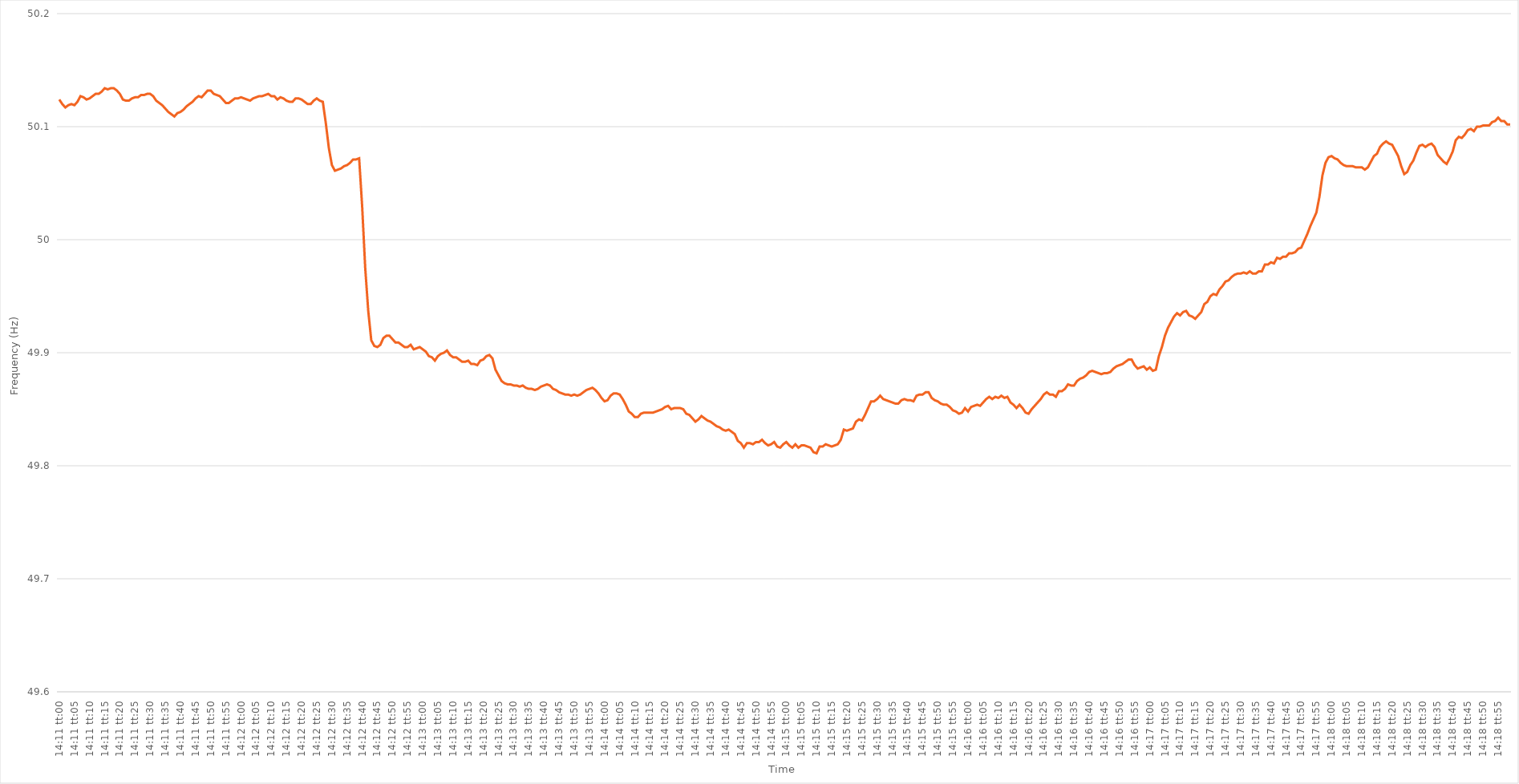
| Category | Series 0 |
|---|---|
| 0.5909722222222222 | 50.124 |
| 0.5909837962962963 | 50.12 |
| 0.5909953703703704 | 50.117 |
| 0.5910069444444445 | 50.119 |
| 0.5910185185185185 | 50.12 |
| 0.5910300925925925 | 50.119 |
| 0.5910416666666667 | 50.122 |
| 0.5910532407407407 | 50.127 |
| 0.5910648148148149 | 50.126 |
| 0.5910763888888889 | 50.124 |
| 0.591087962962963 | 50.125 |
| 0.591099537037037 | 50.127 |
| 0.5911111111111111 | 50.129 |
| 0.5911226851851852 | 50.129 |
| 0.5911342592592593 | 50.131 |
| 0.5911458333333334 | 50.134 |
| 0.5911574074074074 | 50.133 |
| 0.5911689814814814 | 50.134 |
| 0.5911805555555555 | 50.134 |
| 0.5911921296296296 | 50.132 |
| 0.5912037037037037 | 50.129 |
| 0.5912152777777778 | 50.124 |
| 0.5912268518518519 | 50.123 |
| 0.5912384259259259 | 50.123 |
| 0.5912499999999999 | 50.125 |
| 0.5912615740740741 | 50.126 |
| 0.5912731481481481 | 50.126 |
| 0.5912847222222223 | 50.128 |
| 0.5912962962962963 | 50.128 |
| 0.5913078703703704 | 50.129 |
| 0.5913194444444444 | 50.129 |
| 0.5913310185185185 | 50.127 |
| 0.5913425925925926 | 50.123 |
| 0.5913541666666667 | 50.121 |
| 0.5913657407407408 | 50.119 |
| 0.5913773148148148 | 50.116 |
| 0.5913888888888889 | 50.113 |
| 0.5914004629629629 | 50.111 |
| 0.591412037037037 | 50.109 |
| 0.5914236111111111 | 50.112 |
| 0.5914351851851852 | 50.113 |
| 0.5914467592592593 | 50.115 |
| 0.5914583333333333 | 50.118 |
| 0.5914699074074073 | 50.12 |
| 0.5914814814814815 | 50.122 |
| 0.5914930555555555 | 50.125 |
| 0.5915046296296297 | 50.127 |
| 0.5915162037037037 | 50.126 |
| 0.5915277777777778 | 50.129 |
| 0.5915393518518518 | 50.132 |
| 0.591550925925926 | 50.132 |
| 0.5915625 | 50.129 |
| 0.5915740740740741 | 50.128 |
| 0.5915856481481482 | 50.127 |
| 0.5915972222222222 | 50.124 |
| 0.5916087962962963 | 50.121 |
| 0.5916203703703703 | 50.121 |
| 0.5916319444444444 | 50.123 |
| 0.5916435185185185 | 50.125 |
| 0.5916550925925926 | 50.125 |
| 0.5916666666666667 | 50.126 |
| 0.5916782407407407 | 50.125 |
| 0.5916898148148148 | 50.124 |
| 0.5917013888888889 | 50.123 |
| 0.5917129629629629 | 50.125 |
| 0.5917245370370371 | 50.126 |
| 0.5917361111111111 | 50.127 |
| 0.5917476851851852 | 50.127 |
| 0.5917592592592592 | 50.128 |
| 0.5917708333333334 | 50.129 |
| 0.5917824074074074 | 50.127 |
| 0.5917939814814815 | 50.127 |
| 0.5918055555555556 | 50.124 |
| 0.5918171296296296 | 50.126 |
| 0.5918287037037037 | 50.125 |
| 0.5918402777777778 | 50.123 |
| 0.5918518518518519 | 50.122 |
| 0.5918634259259259 | 50.122 |
| 0.591875 | 50.125 |
| 0.5918865740740741 | 50.125 |
| 0.5918981481481481 | 50.124 |
| 0.5919097222222222 | 50.122 |
| 0.5919212962962963 | 50.12 |
| 0.5919328703703703 | 50.12 |
| 0.5919444444444445 | 50.123 |
| 0.5919560185185185 | 50.125 |
| 0.5919675925925926 | 50.123 |
| 0.5919791666666666 | 50.122 |
| 0.5919907407407408 | 50.103 |
| 0.5920023148148148 | 50.081 |
| 0.592013888888889 | 50.066 |
| 0.592025462962963 | 50.061 |
| 0.592037037037037 | 50.062 |
| 0.5920486111111111 | 50.063 |
| 0.5920601851851852 | 50.065 |
| 0.5920717592592593 | 50.066 |
| 0.5920833333333334 | 50.068 |
| 0.5920949074074074 | 50.071 |
| 0.5921064814814815 | 50.071 |
| 0.5921180555555555 | 50.072 |
| 0.5921296296296296 | 50.029 |
| 0.5921412037037037 | 49.975 |
| 0.5921527777777778 | 49.937 |
| 0.5921643518518519 | 49.911 |
| 0.5921759259259259 | 49.906 |
| 0.5921875 | 49.905 |
| 0.592199074074074 | 49.907 |
| 0.5922106481481482 | 49.913 |
| 0.5922222222222222 | 49.915 |
| 0.5922337962962964 | 49.915 |
| 0.5922453703703704 | 49.912 |
| 0.5922569444444444 | 49.909 |
| 0.5922685185185185 | 49.909 |
| 0.5922800925925926 | 49.907 |
| 0.5922916666666667 | 49.905 |
| 0.5923032407407408 | 49.905 |
| 0.5923148148148148 | 49.907 |
| 0.5923263888888889 | 49.903 |
| 0.5923379629629629 | 49.904 |
| 0.592349537037037 | 49.905 |
| 0.5923611111111111 | 49.903 |
| 0.5923726851851852 | 49.901 |
| 0.5923842592592593 | 49.897 |
| 0.5923958333333333 | 49.896 |
| 0.5924074074074074 | 49.893 |
| 0.5924189814814814 | 49.897 |
| 0.5924305555555556 | 49.899 |
| 0.5924421296296296 | 49.9 |
| 0.5924537037037038 | 49.902 |
| 0.5924652777777778 | 49.898 |
| 0.5924768518518518 | 49.896 |
| 0.5924884259259259 | 49.896 |
| 0.5925 | 49.894 |
| 0.5925115740740741 | 49.892 |
| 0.5925231481481482 | 49.892 |
| 0.5925347222222223 | 49.893 |
| 0.5925462962962963 | 49.89 |
| 0.5925578703703703 | 49.89 |
| 0.5925694444444445 | 49.889 |
| 0.5925810185185185 | 49.893 |
| 0.5925925925925926 | 49.894 |
| 0.5926041666666667 | 49.897 |
| 0.5926157407407407 | 49.898 |
| 0.5926273148148148 | 49.895 |
| 0.5926388888888888 | 49.885 |
| 0.592650462962963 | 49.88 |
| 0.592662037037037 | 49.875 |
| 0.5926736111111112 | 49.873 |
| 0.5926851851851852 | 49.872 |
| 0.5926967592592592 | 49.872 |
| 0.5927083333333333 | 49.871 |
| 0.5927199074074074 | 49.871 |
| 0.5927314814814815 | 49.87 |
| 0.5927430555555556 | 49.871 |
| 0.5927546296296297 | 49.869 |
| 0.5927662037037037 | 49.868 |
| 0.5927777777777777 | 49.868 |
| 0.5927893518518519 | 49.867 |
| 0.5928009259259259 | 49.868 |
| 0.5928125 | 49.87 |
| 0.5928240740740741 | 49.871 |
| 0.5928356481481482 | 49.872 |
| 0.5928472222222222 | 49.871 |
| 0.5928587962962962 | 49.868 |
| 0.5928703703703704 | 49.867 |
| 0.5928819444444444 | 49.865 |
| 0.5928935185185186 | 49.864 |
| 0.5929050925925926 | 49.863 |
| 0.5929166666666666 | 49.863 |
| 0.5929282407407407 | 49.862 |
| 0.5929398148148148 | 49.863 |
| 0.5929513888888889 | 49.862 |
| 0.592962962962963 | 49.863 |
| 0.5929745370370371 | 49.865 |
| 0.5929861111111111 | 49.867 |
| 0.5929976851851851 | 49.868 |
| 0.5930092592592593 | 49.869 |
| 0.5930208333333333 | 49.867 |
| 0.5930324074074075 | 49.864 |
| 0.5930439814814815 | 49.86 |
| 0.5930555555555556 | 49.857 |
| 0.5930671296296296 | 49.858 |
| 0.5930787037037036 | 49.862 |
| 0.5930902777777778 | 49.864 |
| 0.5931018518518518 | 49.864 |
| 0.593113425925926 | 49.863 |
| 0.593125 | 49.859 |
| 0.593136574074074 | 49.854 |
| 0.5931481481481481 | 49.848 |
| 0.5931597222222222 | 49.846 |
| 0.5931712962962963 | 49.843 |
| 0.5931828703703704 | 49.843 |
| 0.5931944444444445 | 49.846 |
| 0.5932060185185185 | 49.847 |
| 0.5932175925925925 | 49.847 |
| 0.5932291666666667 | 49.847 |
| 0.5932407407407407 | 49.847 |
| 0.5932523148148149 | 49.848 |
| 0.5932638888888889 | 49.849 |
| 0.593275462962963 | 49.85 |
| 0.593287037037037 | 49.852 |
| 0.593298611111111 | 49.853 |
| 0.5933101851851852 | 49.85 |
| 0.5933217592592592 | 49.851 |
| 0.5933333333333334 | 49.851 |
| 0.5933449074074074 | 49.851 |
| 0.5933564814814815 | 49.85 |
| 0.5933680555555555 | 49.846 |
| 0.5933796296296296 | 49.845 |
| 0.5933912037037037 | 49.842 |
| 0.5934027777777778 | 49.839 |
| 0.5934143518518519 | 49.841 |
| 0.5934259259259259 | 49.844 |
| 0.5934375 | 49.842 |
| 0.5934490740740741 | 49.84 |
| 0.5934606481481481 | 49.839 |
| 0.5934722222222223 | 49.837 |
| 0.5934837962962963 | 49.835 |
| 0.5934953703703704 | 49.834 |
| 0.5935069444444444 | 49.832 |
| 0.5935185185185184 | 49.831 |
| 0.5935300925925926 | 49.832 |
| 0.5935416666666666 | 49.83 |
| 0.5935532407407408 | 49.828 |
| 0.5935648148148148 | 49.822 |
| 0.5935763888888889 | 49.82 |
| 0.5935879629629629 | 49.816 |
| 0.593599537037037 | 49.82 |
| 0.5936111111111111 | 49.82 |
| 0.5936226851851852 | 49.819 |
| 0.5936342592592593 | 49.821 |
| 0.5936458333333333 | 49.821 |
| 0.5936574074074074 | 49.823 |
| 0.5936689814814815 | 49.82 |
| 0.5936805555555555 | 49.818 |
| 0.5936921296296297 | 49.819 |
| 0.5937037037037037 | 49.821 |
| 0.5937152777777778 | 49.817 |
| 0.5937268518518518 | 49.816 |
| 0.593738425925926 | 49.819 |
| 0.59375 | 49.821 |
| 0.593761574074074 | 49.818 |
| 0.5937731481481482 | 49.816 |
| 0.5937847222222222 | 49.819 |
| 0.5937962962962963 | 49.816 |
| 0.5938078703703703 | 49.818 |
| 0.5938194444444445 | 49.818 |
| 0.5938310185185185 | 49.817 |
| 0.5938425925925926 | 49.816 |
| 0.5938541666666667 | 49.812 |
| 0.5938657407407407 | 49.811 |
| 0.5938773148148148 | 49.817 |
| 0.5938888888888889 | 49.817 |
| 0.593900462962963 | 49.819 |
| 0.5939120370370371 | 49.818 |
| 0.5939236111111111 | 49.817 |
| 0.5939351851851852 | 49.818 |
| 0.5939467592592592 | 49.819 |
| 0.5939583333333334 | 49.823 |
| 0.5939699074074074 | 49.832 |
| 0.5939814814814816 | 49.831 |
| 0.5939930555555556 | 49.832 |
| 0.5940046296296296 | 49.833 |
| 0.5940162037037037 | 49.839 |
| 0.5940277777777777 | 49.841 |
| 0.5940393518518519 | 49.84 |
| 0.5940509259259259 | 49.845 |
| 0.5940625 | 49.851 |
| 0.5940740740740741 | 49.857 |
| 0.5940856481481481 | 49.857 |
| 0.5940972222222222 | 49.859 |
| 0.5941087962962963 | 49.862 |
| 0.5941203703703704 | 49.859 |
| 0.5941319444444445 | 49.858 |
| 0.5941435185185185 | 49.857 |
| 0.5941550925925926 | 49.856 |
| 0.5941666666666666 | 49.855 |
| 0.5941782407407408 | 49.855 |
| 0.5941898148148148 | 49.858 |
| 0.594201388888889 | 49.859 |
| 0.594212962962963 | 49.858 |
| 0.594224537037037 | 49.858 |
| 0.5942361111111111 | 49.857 |
| 0.5942476851851851 | 49.862 |
| 0.5942592592592593 | 49.863 |
| 0.5942708333333333 | 49.863 |
| 0.5942824074074075 | 49.865 |
| 0.5942939814814815 | 49.865 |
| 0.5943055555555555 | 49.86 |
| 0.5943171296296296 | 49.858 |
| 0.5943287037037037 | 49.857 |
| 0.5943402777777778 | 49.855 |
| 0.5943518518518519 | 49.854 |
| 0.594363425925926 | 49.854 |
| 0.594375 | 49.852 |
| 0.594386574074074 | 49.849 |
| 0.5943981481481482 | 49.848 |
| 0.5944097222222222 | 49.846 |
| 0.5944212962962964 | 49.847 |
| 0.5944328703703704 | 49.851 |
| 0.5944444444444444 | 49.848 |
| 0.5944560185185185 | 49.852 |
| 0.5944675925925926 | 49.853 |
| 0.5944791666666667 | 49.854 |
| 0.5944907407407407 | 49.853 |
| 0.5945023148148149 | 49.856 |
| 0.5945138888888889 | 49.859 |
| 0.5945254629629629 | 49.861 |
| 0.594537037037037 | 49.859 |
| 0.5945486111111111 | 49.861 |
| 0.5945601851851852 | 49.86 |
| 0.5945717592592593 | 49.862 |
| 0.5945833333333334 | 49.86 |
| 0.5945949074074074 | 49.861 |
| 0.5946064814814814 | 49.856 |
| 0.5946180555555556 | 49.854 |
| 0.5946296296296296 | 49.851 |
| 0.5946412037037038 | 49.854 |
| 0.5946527777777778 | 49.851 |
| 0.5946643518518518 | 49.847 |
| 0.5946759259259259 | 49.846 |
| 0.5946875 | 49.85 |
| 0.5946990740740741 | 49.853 |
| 0.5947106481481481 | 49.856 |
| 0.5947222222222223 | 49.859 |
| 0.5947337962962963 | 49.863 |
| 0.5947453703703703 | 49.865 |
| 0.5947569444444444 | 49.863 |
| 0.5947685185185185 | 49.863 |
| 0.5947800925925926 | 49.861 |
| 0.5947916666666667 | 49.866 |
| 0.5948032407407408 | 49.866 |
| 0.5948148148148148 | 49.868 |
| 0.5948263888888888 | 49.872 |
| 0.594837962962963 | 49.871 |
| 0.594849537037037 | 49.871 |
| 0.5948611111111112 | 49.875 |
| 0.5948726851851852 | 49.877 |
| 0.5948842592592593 | 49.878 |
| 0.5948958333333333 | 49.88 |
| 0.5949074074074074 | 49.883 |
| 0.5949189814814815 | 49.884 |
| 0.5949305555555555 | 49.883 |
| 0.5949421296296297 | 49.882 |
| 0.5949537037037037 | 49.881 |
| 0.5949652777777777 | 49.882 |
| 0.5949768518518518 | 49.882 |
| 0.5949884259259259 | 49.883 |
| 0.595 | 49.886 |
| 0.5950115740740741 | 49.888 |
| 0.5950231481481482 | 49.889 |
| 0.5950347222222222 | 49.89 |
| 0.5950462962962962 | 49.892 |
| 0.5950578703703704 | 49.894 |
| 0.5950694444444444 | 49.894 |
| 0.5950810185185186 | 49.889 |
| 0.5950925925925926 | 49.886 |
| 0.5951041666666667 | 49.887 |
| 0.5951157407407407 | 49.888 |
| 0.5951273148148148 | 49.885 |
| 0.5951388888888889 | 49.887 |
| 0.595150462962963 | 49.884 |
| 0.5951620370370371 | 49.885 |
| 0.5951736111111111 | 49.897 |
| 0.5951851851851852 | 49.905 |
| 0.5951967592592592 | 49.915 |
| 0.5952083333333333 | 49.922 |
| 0.5952199074074074 | 49.927 |
| 0.5952314814814815 | 49.932 |
| 0.5952430555555556 | 49.935 |
| 0.5952546296296296 | 49.933 |
| 0.5952662037037036 | 49.936 |
| 0.5952777777777778 | 49.937 |
| 0.5952893518518518 | 49.933 |
| 0.595300925925926 | 49.932 |
| 0.5953125 | 49.93 |
| 0.5953240740740741 | 49.933 |
| 0.5953356481481481 | 49.936 |
| 0.5953472222222222 | 49.943 |
| 0.5953587962962963 | 49.945 |
| 0.5953703703703704 | 49.95 |
| 0.5953819444444445 | 49.952 |
| 0.5953935185185185 | 49.951 |
| 0.5954050925925926 | 49.956 |
| 0.5954166666666666 | 49.959 |
| 0.5954282407407407 | 49.963 |
| 0.5954398148148148 | 49.964 |
| 0.5954513888888889 | 49.967 |
| 0.595462962962963 | 49.969 |
| 0.595474537037037 | 49.97 |
| 0.595486111111111 | 49.97 |
| 0.5954976851851852 | 49.971 |
| 0.5955092592592592 | 49.97 |
| 0.5955208333333334 | 49.972 |
| 0.5955324074074074 | 49.97 |
| 0.5955439814814815 | 49.97 |
| 0.5955555555555555 | 49.972 |
| 0.5955671296296297 | 49.972 |
| 0.5955787037037037 | 49.978 |
| 0.5955902777777778 | 49.978 |
| 0.5956018518518519 | 49.98 |
| 0.5956134259259259 | 49.979 |
| 0.595625 | 49.984 |
| 0.595636574074074 | 49.983 |
| 0.5956481481481481 | 49.985 |
| 0.5956597222222222 | 49.985 |
| 0.5956712962962963 | 49.988 |
| 0.5956828703703704 | 49.988 |
| 0.5956944444444444 | 49.989 |
| 0.5957060185185185 | 49.992 |
| 0.5957175925925926 | 49.993 |
| 0.5957291666666666 | 49.999 |
| 0.5957407407407408 | 50.005 |
| 0.5957523148148148 | 50.012 |
| 0.5957638888888889 | 50.018 |
| 0.5957754629629629 | 50.024 |
| 0.5957870370370371 | 50.038 |
| 0.5957986111111111 | 50.057 |
| 0.5958101851851852 | 50.068 |
| 0.5958217592592593 | 50.073 |
| 0.5958333333333333 | 50.074 |
| 0.5958449074074074 | 50.072 |
| 0.5958564814814815 | 50.071 |
| 0.5958680555555556 | 50.068 |
| 0.5958796296296297 | 50.066 |
| 0.5958912037037037 | 50.065 |
| 0.5959027777777778 | 50.065 |
| 0.5959143518518518 | 50.065 |
| 0.5959259259259259 | 50.064 |
| 0.5959375 | 50.064 |
| 0.595949074074074 | 50.064 |
| 0.5959606481481482 | 50.062 |
| 0.5959722222222222 | 50.064 |
| 0.5959837962962963 | 50.069 |
| 0.5959953703703703 | 50.074 |
| 0.5960069444444445 | 50.076 |
| 0.5960185185185185 | 50.082 |
| 0.5960300925925927 | 50.085 |
| 0.5960416666666667 | 50.087 |
| 0.5960532407407407 | 50.085 |
| 0.5960648148148148 | 50.084 |
| 0.5960763888888889 | 50.079 |
| 0.596087962962963 | 50.074 |
| 0.5960995370370371 | 50.065 |
| 0.5961111111111111 | 50.058 |
| 0.5961226851851852 | 50.06 |
| 0.5961342592592592 | 50.066 |
| 0.5961458333333333 | 50.07 |
| 0.5961574074074074 | 50.077 |
| 0.5961689814814815 | 50.083 |
| 0.5961805555555556 | 50.084 |
| 0.5961921296296296 | 50.082 |
| 0.5962037037037037 | 50.084 |
| 0.5962152777777777 | 50.085 |
| 0.5962268518518519 | 50.082 |
| 0.5962384259259259 | 50.075 |
| 0.5962500000000001 | 50.072 |
| 0.5962615740740741 | 50.069 |
| 0.5962731481481481 | 50.067 |
| 0.5962847222222222 | 50.072 |
| 0.5962962962962963 | 50.078 |
| 0.5963078703703704 | 50.088 |
| 0.5963194444444445 | 50.091 |
| 0.5963310185185186 | 50.09 |
| 0.5963425925925926 | 50.093 |
| 0.5963541666666666 | 50.097 |
| 0.5963657407407407 | 50.098 |
| 0.5963773148148148 | 50.096 |
| 0.5963888888888889 | 50.1 |
| 0.596400462962963 | 50.1 |
| 0.596412037037037 | 50.101 |
| 0.5964236111111111 | 50.101 |
| 0.5964351851851851 | 50.101 |
| 0.5964467592592593 | 50.104 |
| 0.5964583333333333 | 50.105 |
| 0.5964699074074075 | 50.108 |
| 0.5964814814814815 | 50.105 |
| 0.5964930555555555 | 50.105 |
| 0.5965046296296296 | 50.102 |
| 0.5965162037037037 | 50.102 |